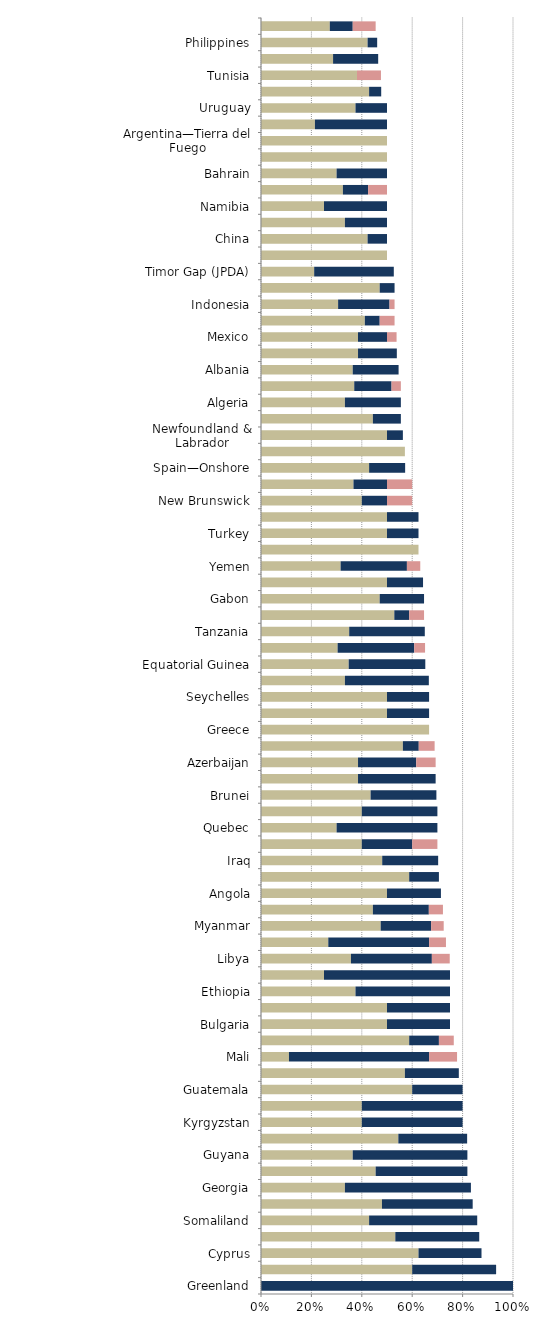
| Category |   Mild deterrent to investment |   Strong deterrent to investment |   Would not pursue investment due to this factor |
|---|---|---|---|
| Greenland | 0 | 1 | 0 |
| Madagascar | 0.6 | 0.333 | 0 |
| Cyprus | 0.625 | 0.25 | 0 |
| Democratic Republic of the Congo (Kinshasa) | 0.533 | 0.333 | 0 |
| Somaliland | 0.429 | 0.429 | 0 |
| Papua New Guinea | 0.48 | 0.36 | 0 |
| Georgia | 0.333 | 0.5 | 0 |
| Russia—Offshore Arctic | 0.455 | 0.364 | 0 |
| Guyana | 0.364 | 0.455 | 0 |
| Mauritania | 0.545 | 0.273 | 0 |
| Kyrgyzstan | 0.4 | 0.4 | 0 |
| Turkmenistan | 0.4 | 0.4 | 0 |
| Guatemala | 0.6 | 0.2 | 0 |
| Bolivia | 0.571 | 0.214 | 0 |
| Mali | 0.111 | 0.556 | 0.111 |
| Bangladesh | 0.588 | 0.118 | 0.059 |
| Bulgaria | 0.5 | 0.25 | 0 |
| Russia—Eastern Siberia | 0.5 | 0.25 | 0 |
| Ethiopia | 0.375 | 0.375 | 0 |
| Syria | 0.25 | 0.5 | 0 |
| Libya | 0.357 | 0.321 | 0.071 |
| South Sudan | 0.267 | 0.4 | 0.067 |
| Myanmar | 0.475 | 0.2 | 0.05 |
| Brazil—Onshore CC | 0.444 | 0.222 | 0.056 |
| Angola | 0.5 | 0.214 | 0 |
| Cameroon | 0.588 | 0.118 | 0 |
| Iraq | 0.481 | 0.222 | 0 |
| Niger | 0.4 | 0.2 | 0.1 |
| Quebec | 0.3 | 0.4 | 0 |
| Suriname | 0.4 | 0.3 | 0 |
| Brunei | 0.435 | 0.261 | 0 |
| Mozambique | 0.385 | 0.308 | 0 |
| Azerbaijan | 0.385 | 0.231 | 0.077 |
| Chad | 0.563 | 0.063 | 0.063 |
| Greece | 0.667 | 0 | 0 |
| Uzbekistan | 0.5 | 0.167 | 0 |
| Seychelles | 0.5 | 0.167 | 0 |
| Russia—Offshore Sakhalin | 0.333 | 0.333 | 0 |
| Equatorial Guinea | 0.348 | 0.304 | 0 |
| Brazil—Offshore presalt area PSC | 0.304 | 0.304 | 0.043 |
| Tanzania | 0.35 | 0.3 | 0 |
| Cambodia | 0.529 | 0.059 | 0.059 |
| Gabon | 0.471 | 0.176 | 0 |
| Republic of the Congo (Brazzaville) | 0.5 | 0.143 | 0 |
| Yemen | 0.316 | 0.263 | 0.053 |
| Faroe Islands | 0.625 | 0 | 0 |
| Turkey | 0.5 | 0.125 | 0 |
| Uganda | 0.5 | 0.125 | 0 |
| New Brunswick | 0.4 | 0.1 | 0.1 |
| Venezuela | 0.367 | 0.133 | 0.1 |
| Spain—Onshore | 0.429 | 0.143 | 0 |
| Northwest Territories | 0.571 | 0 | 0 |
| Newfoundland & Labrador | 0.5 | 0.063 | 0 |
| Japan | 0.444 | 0.111 | 0 |
| Algeria | 0.333 | 0.222 | 0 |
| Egypt | 0.37 | 0.148 | 0.037 |
| Albania | 0.364 | 0.182 | 0 |
| Ukraine | 0.385 | 0.154 | 0 |
| Mexico | 0.385 | 0.115 | 0.038 |
| Nova Scotia | 0.412 | 0.059 | 0.059 |
| Indonesia | 0.306 | 0.204 | 0.02 |
| Morocco | 0.471 | 0.059 | 0 |
| Timor Gap (JPDA) | 0.211 | 0.316 | 0 |
| Yukon | 0.5 | 0 | 0 |
| China | 0.423 | 0.077 | 0 |
| Kazakhstan | 0.333 | 0.167 | 0 |
| Namibia | 0.25 | 0.25 | 0 |
| Nigeria | 0.325 | 0.1 | 0.075 |
| Bahrain | 0.3 | 0.2 | 0 |
| Lebanon | 0.5 | 0 | 0 |
| Argentina—Tierra del Fuego | 0.5 | 0 | 0 |
| Ecuador | 0.214 | 0.286 | 0 |
| Uruguay | 0.375 | 0.125 | 0 |
| Kenya | 0.429 | 0.048 | 0 |
| Tunisia | 0.381 | 0 | 0.095 |
| Brazil—Offshore CC | 0.286 | 0.179 | 0 |
| Philippines | 0.423 | 0.038 | 0 |
| Iran | 0.273 | 0.091 | 0.091 |